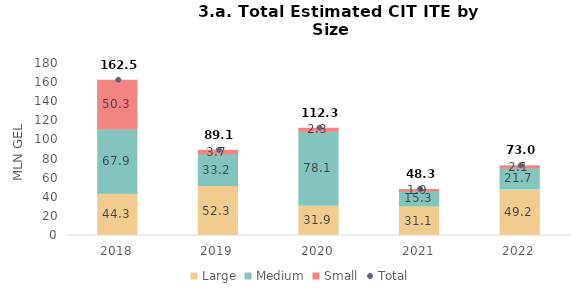
| Category | Large | Medium | Small |
|---|---|---|---|
| 2018.0 | 44.26 | 67.89 | 50.33 |
| 2019.0 | 52.26 | 33.18 | 3.65 |
| 2020.0 | 31.91 | 78.06 | 2.35 |
| 2021.0 | 31.11 | 15.27 | 1.88 |
| 2022.0 | 49.19 | 21.74 | 2.06 |